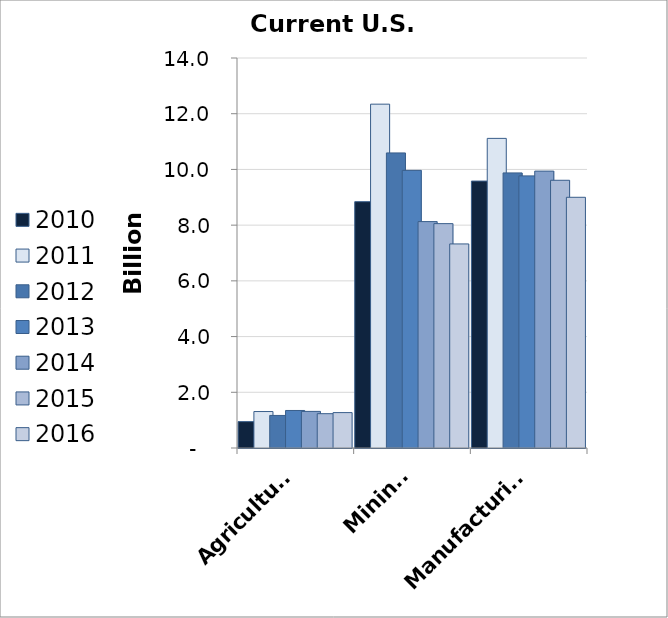
| Category | 2010 | 2011 | 2012 | 2013 | 2014 | 2015 | 2016 |
|---|---|---|---|---|---|---|---|
| Agriculture | 0.947 | 1.309 | 1.169 | 1.347 | 1.314 | 1.232 | 1.271 |
| Mining | 8.842 | 12.343 | 10.592 | 9.966 | 8.127 | 8.054 | 7.325 |
| Manufacturing | 9.582 | 11.114 | 9.875 | 9.768 | 9.94 | 9.611 | 9 |